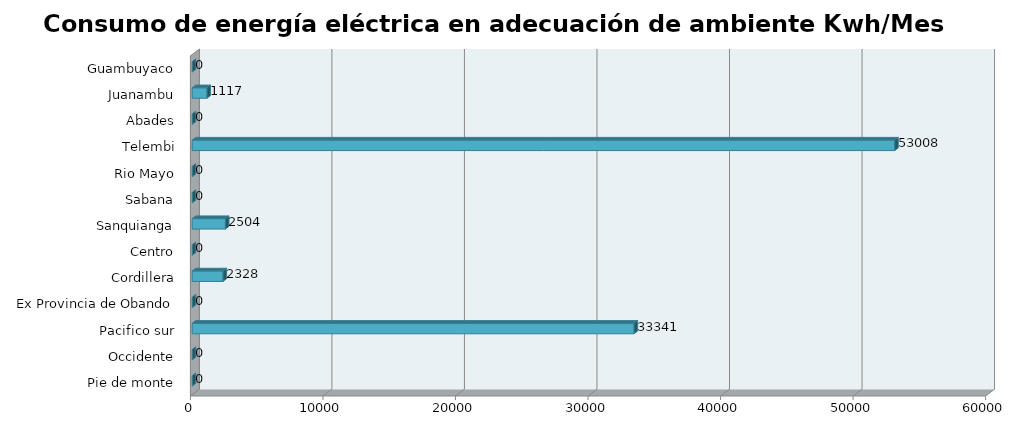
| Category | Series 0 |
|---|---|
| Pie de monte | 0 |
| Occidente | 0 |
| Pacifico sur | 33340.763 |
| Ex Provincia de Obando | 0 |
| Cordillera | 2328.098 |
| Centro | 0 |
| Sanquianga | 2503.947 |
| Sabana | 0 |
| Rio Mayo | 0 |
| Telembi | 53007.894 |
| Abades | 0 |
| Juanambu | 1116.557 |
| Guambuyaco | 0 |